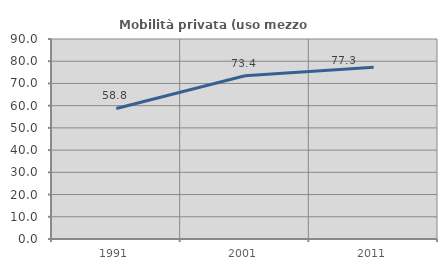
| Category | Mobilità privata (uso mezzo privato) |
|---|---|
| 1991.0 | 58.753 |
| 2001.0 | 73.446 |
| 2011.0 | 77.322 |